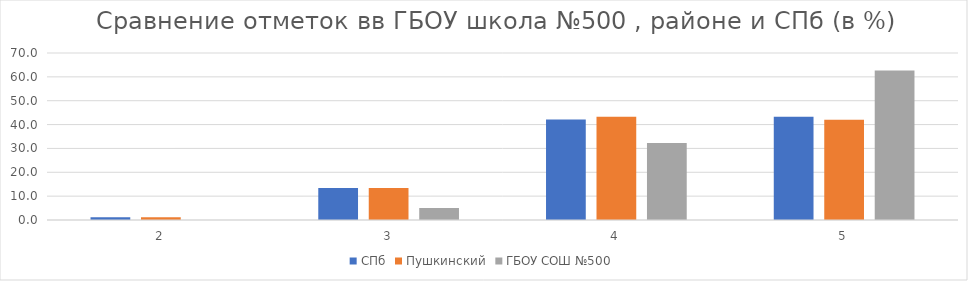
| Category | СПб | Пушкинский | ГБОУ СОШ №500 |
|---|---|---|---|
| 2.0 | 1.18 | 1.2 | 0 |
| 3.0 | 13.39 | 13.41 | 5.05 |
| 4.0 | 42.14 | 43.33 | 32.32 |
| 5.0 | 43.28 | 42.06 | 62.63 |